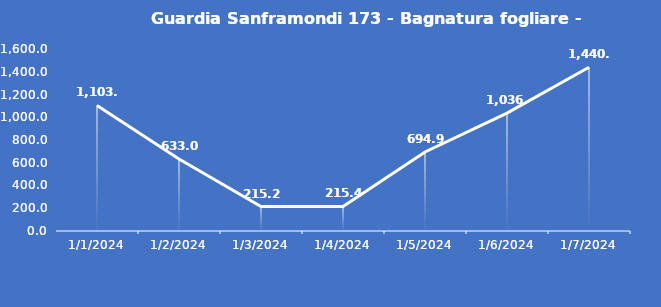
| Category | Guardia Sanframondi 173 - Bagnatura fogliare - Grezzo (min) |
|---|---|
| 1/1/24 | 1103.9 |
| 1/2/24 | 633 |
| 1/3/24 | 215.2 |
| 1/4/24 | 215.4 |
| 1/5/24 | 694.9 |
| 1/6/24 | 1036.5 |
| 1/7/24 | 1440 |